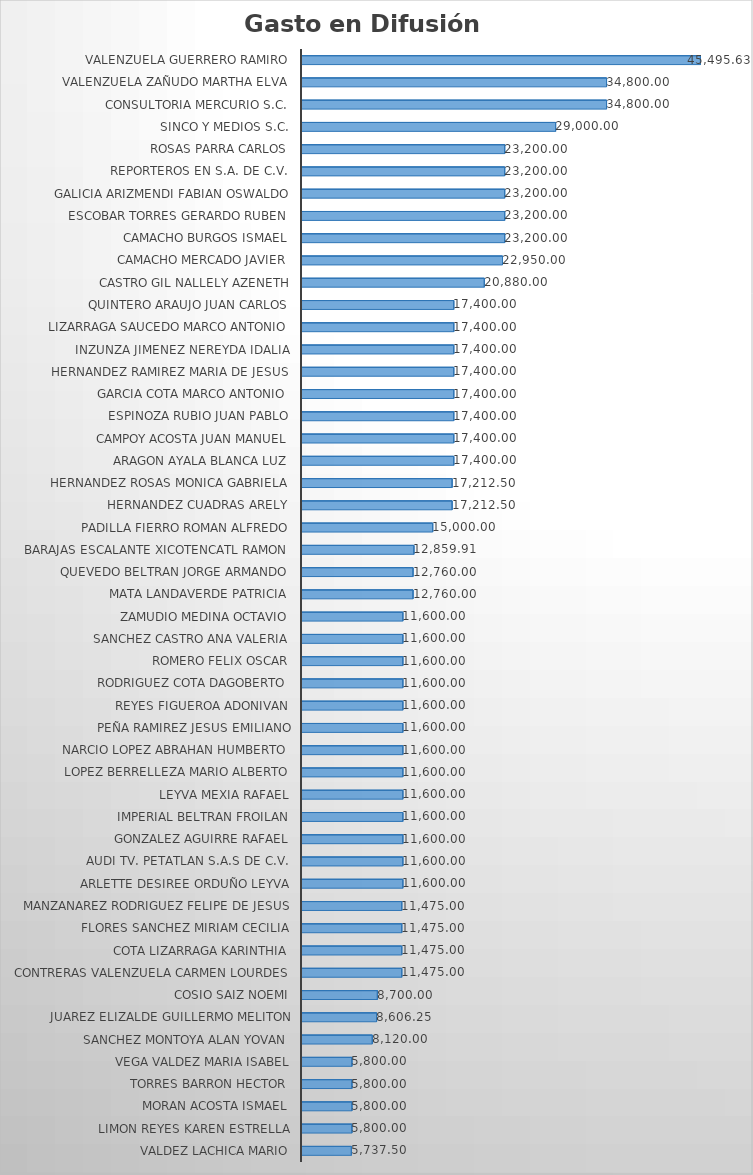
| Category | Suma |
|---|---|
| VALDEZ LACHICA MARIO | 5737.5 |
| LIMON REYES KAREN ESTRELLA | 5800 |
| MORAN ACOSTA ISMAEL | 5800 |
| TORRES BARRON HECTOR | 5800 |
| VEGA VALDEZ MARIA ISABEL | 5800 |
| SANCHEZ MONTOYA ALAN YOVAN | 8120 |
| JUAREZ ELIZALDE GUILLERMO MELITON | 8606.25 |
| COSIO SAIZ NOEMI | 8700 |
| CONTRERAS VALENZUELA CARMEN LOURDES | 11475 |
| COTA LIZARRAGA KARINTHIA | 11475 |
| FLORES SANCHEZ MIRIAM CECILIA | 11475 |
| MANZANAREZ RODRIGUEZ FELIPE DE JESUS | 11475 |
| ARLETTE DESIREE ORDUÑO LEYVA | 11600 |
| AUDI TV. PETATLAN S.A.S DE C.V. | 11600 |
| GONZALEZ AGUIRRE RAFAEL | 11600 |
| IMPERIAL BELTRAN FROILAN | 11600 |
| LEYVA MEXIA RAFAEL | 11600 |
| LOPEZ BERRELLEZA MARIO ALBERTO | 11600 |
| NARCIO LOPEZ ABRAHAN HUMBERTO | 11600 |
| PEÑA RAMIREZ JESUS EMILIANO | 11600 |
| REYES FIGUEROA ADONIVAN | 11600 |
| RODRIGUEZ COTA DAGOBERTO | 11600 |
| ROMERO FELIX OSCAR | 11600 |
| SANCHEZ CASTRO ANA VALERIA | 11600 |
| ZAMUDIO MEDINA OCTAVIO | 11600 |
| MATA LANDAVERDE PATRICIA | 12760 |
| QUEVEDO BELTRAN JORGE ARMANDO | 12760 |
| BARAJAS ESCALANTE XICOTENCATL RAMON | 12859.91 |
| PADILLA FIERRO ROMAN ALFREDO | 15000 |
| HERNANDEZ CUADRAS ARELY | 17212.5 |
| HERNANDEZ ROSAS MONICA GABRIELA | 17212.5 |
| ARAGON AYALA BLANCA LUZ | 17400 |
| CAMPOY ACOSTA JUAN MANUEL | 17400 |
| ESPINOZA RUBIO JUAN PABLO | 17400 |
| GARCIA COTA MARCO ANTONIO | 17400 |
| HERNANDEZ RAMIREZ MARIA DE JESUS | 17400 |
| INZUNZA JIMENEZ NEREYDA IDALIA | 17400 |
| LIZARRAGA SAUCEDO MARCO ANTONIO | 17400 |
| QUINTERO ARAUJO JUAN CARLOS | 17400 |
| CASTRO GIL NALLELY AZENETH | 20880 |
| CAMACHO MERCADO JAVIER | 22950 |
| CAMACHO BURGOS ISMAEL | 23200 |
| ESCOBAR TORRES GERARDO RUBEN | 23200 |
| GALICIA ARIZMENDI FABIAN OSWALDO | 23200 |
| REPORTEROS EN S.A. DE C.V. | 23200 |
| ROSAS PARRA CARLOS | 23200 |
| SINCO Y MEDIOS S.C. | 29000 |
| CONSULTORIA MERCURIO S.C. | 34800 |
| VALENZUELA ZAÑUDO MARTHA ELVA | 34800 |
| VALENZUELA GUERRERO RAMIRO | 45495.63 |